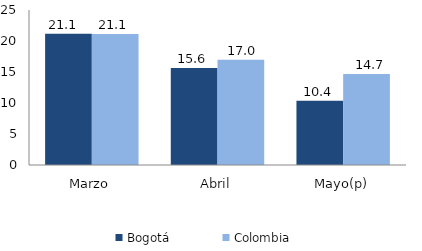
| Category | Bogotá | Colombia |
|---|---|---|
| Marzo | 21.149 | 21.112 |
| Abril | 15.645 | 16.976 |
| Mayo(p) | 10.352 | 14.685 |